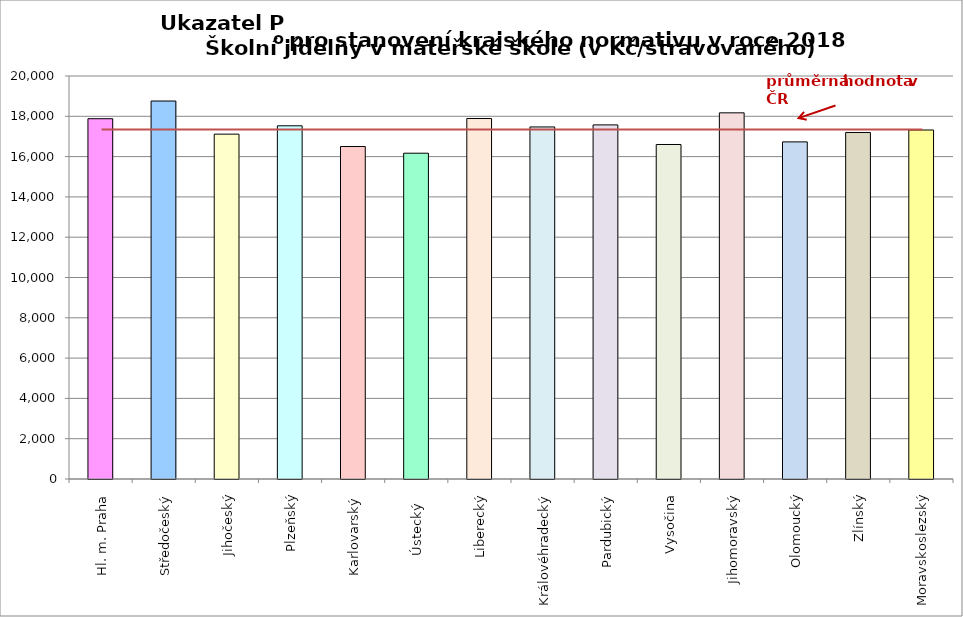
| Category | Series 0 |
|---|---|
| Hl. m. Praha | 17880 |
| Středočeský | 18758 |
| Jihočeský | 17114 |
| Plzeňský | 17529 |
| Karlovarský  | 16500 |
| Ústecký   | 16168 |
| Liberecký | 17890 |
| Královéhradecký | 17472 |
| Pardubický | 17573 |
| Vysočina | 16601 |
| Jihomoravský | 18172 |
| Olomoucký | 16730 |
| Zlínský | 17197 |
| Moravskoslezský | 17320 |